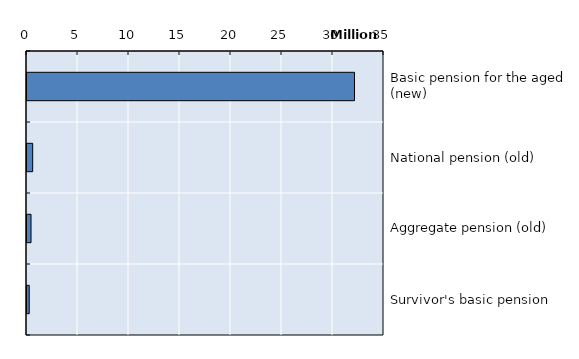
| Category | Series 0 |
|---|---|
| Basic pension for the aged (new) | 32108121 |
| National pension (old) | 556327 |
| Aggregate pension (old) | 394954 |
| Survivor's basic pension | 217837 |